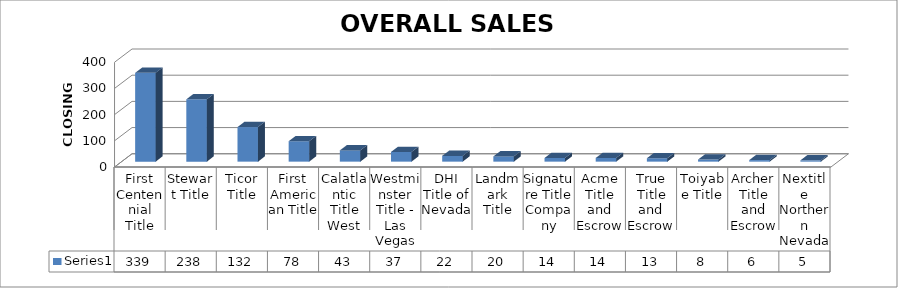
| Category | Series 0 |
|---|---|
| First Centennial Title | 339 |
| Stewart Title | 238 |
| Ticor Title | 132 |
| First American Title | 78 |
| Calatlantic Title West | 43 |
| Westminster Title - Las Vegas | 37 |
| DHI Title of Nevada | 22 |
| Landmark Title | 20 |
| Signature Title Company | 14 |
| Acme Title and Escrow | 14 |
| True Title and Escrow | 13 |
| Toiyabe Title | 8 |
| Archer Title and Escrow | 6 |
| Nextitle Northern Nevada | 5 |